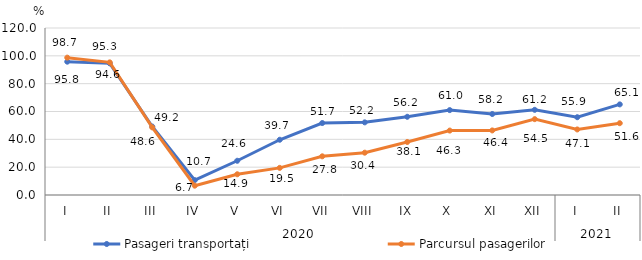
| Category | Pasageri transportați | Parcursul pasagerilor |
|---|---|---|
| 0 | 95.8 | 98.7 |
| 1 | 94.6 | 95.3 |
| 2 | 49.2 | 48.6 |
| 3 | 10.7 | 6.7 |
| 4 | 24.6 | 14.9 |
| 5 | 39.7 | 19.5 |
| 6 | 51.7 | 27.8 |
| 7 | 52.2 | 30.4 |
| 8 | 56.2 | 38.1 |
| 9 | 61 | 46.3 |
| 10 | 58.2 | 46.4 |
| 11 | 61.2 | 54.5 |
| 12 | 55.9 | 47.1 |
| 13 | 65.1 | 51.6 |